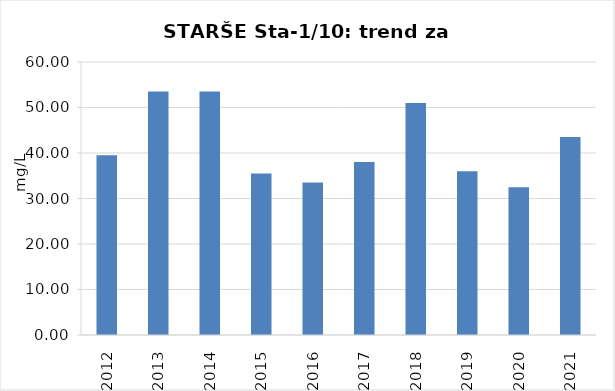
| Category | Vsota |
|---|---|
| 2012 | 39.5 |
| 2013 | 53.5 |
| 2014 | 53.5 |
| 2015 | 35.5 |
| 2016 | 33.5 |
| 2017 | 38 |
| 2018 | 51 |
| 2019 | 36 |
| 2020 | 32.5 |
| 2021 | 43.5 |